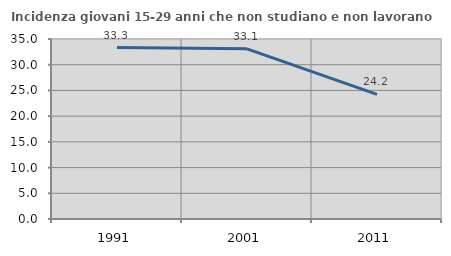
| Category | Incidenza giovani 15-29 anni che non studiano e non lavorano  |
|---|---|
| 1991.0 | 33.333 |
| 2001.0 | 33.094 |
| 2011.0 | 24.231 |